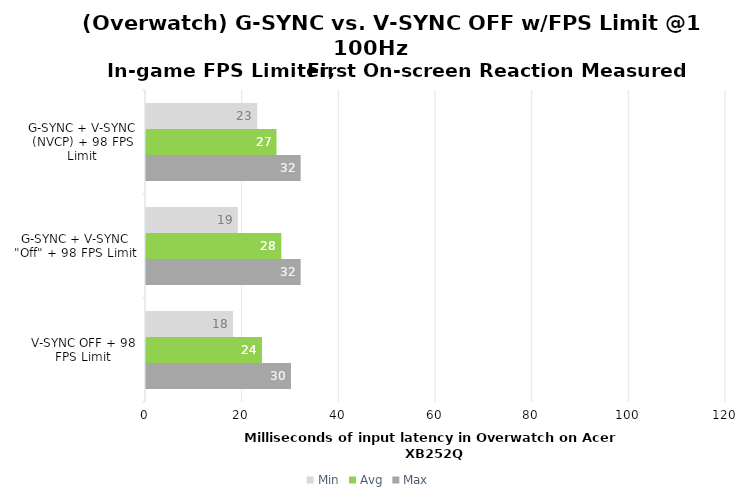
| Category | Min | Avg | Max |
|---|---|---|---|
| G-SYNC + V-SYNC (NVCP) + 98 FPS Limit | 23 | 27 | 32 |
| G-SYNC + V-SYNC "Off" + 98 FPS Limit | 19 | 28 | 32 |
| V-SYNC OFF + 98 FPS Limit | 18 | 24 | 30 |